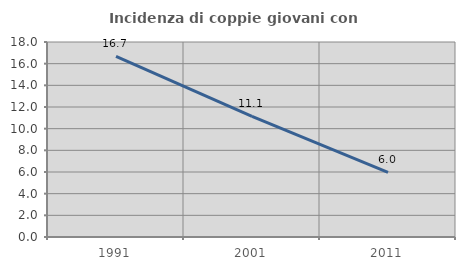
| Category | Incidenza di coppie giovani con figli |
|---|---|
| 1991.0 | 16.667 |
| 2001.0 | 11.126 |
| 2011.0 | 5.972 |